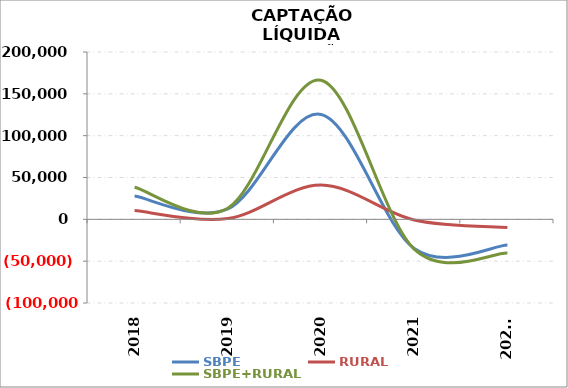
| Category | SBPE | RURAL | SBPE+RURAL |
|---|---|---|---|
| 2018 | 27791.076 | 10469.293 | 38260.369 |
| 2019 | 12389.575 | 937.497 | 13327.072 |
| 2020 | 125352.739 | 40957.163 | 166309.902 |
| 2021 | -34755.497 | -741.413 | -35496.91 |
| 2022* | -30717.118 | -9654.492 | -40371.61 |